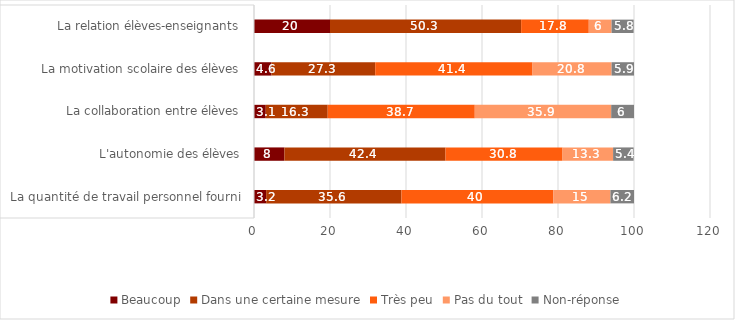
| Category | Beaucoup | Dans une certaine mesure | Très peu | Pas du tout | Non-réponse |
|---|---|---|---|---|---|
| La quantité de travail personnel fourni | 3.2 | 35.6 | 40 | 15 | 6.2 |
| L'autonomie des élèves | 8 | 42.4 | 30.8 | 13.3 | 5.4 |
| La collaboration entre élèves | 3.1 | 16.3 | 38.7 | 35.9 | 6 |
| La motivation scolaire des élèves | 4.6 | 27.3 | 41.4 | 20.8 | 5.9 |
| La relation élèves-enseignants | 20 | 50.3 | 17.8 | 6 | 5.8 |